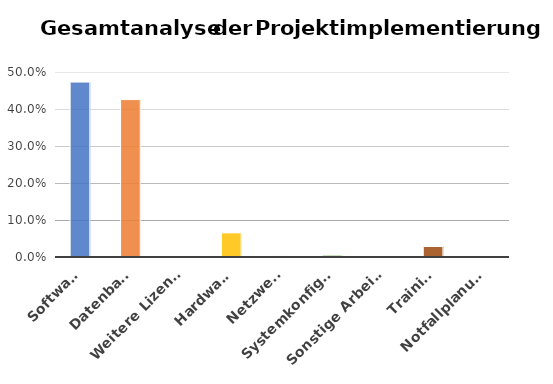
| Category | Series 0 |
|---|---|
| Software | 0.473 |
| Datenbank | 0.425 |
| Weitere Lizenzen | 0 |
| Hardware | 0.065 |
| Netzwerk | 0.003 |
| Systemkonfiguration | 0.005 |
| Sonstige Arbeitskosten | 0 |
| Training | 0.028 |
| Notfallplanung | 0 |